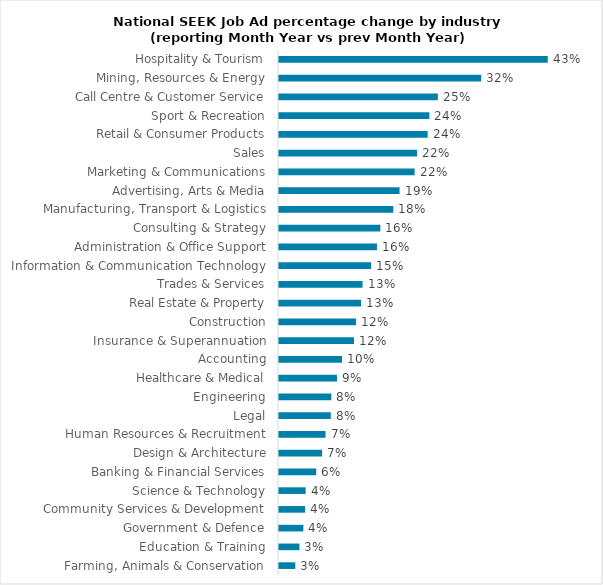
| Category | Series 0 |
|---|---|
| Community Services & Development | 0.08 |
| Farming, Animals & Conservation | 0.069 |
| Hospitality & Tourism | 0.069 |
| Government & Defence | 0.056 |
| Sport & Recreation | 0.056 |
| Engineering | 0.056 |
| Science & Technology | 0.054 |
| Administration & Office Support | 0.052 |
| Advertising, Arts & Media | 0.046 |
| Call Centre & Customer Service | 0.031 |
| Sales | 0.028 |
| Information & Communication Technology | 0.026 |
| Trades & Services | 0.023 |
| Human Resources & Recruitment | 0.022 |
| Healthcare & Medical | 0.021 |
| Design & Architecture | 0.017 |
| Manufacturing, Transport & Logistics | 0.012 |
| Marketing & Communications | 0.009 |
| Education & Training | 0.008 |
| Mining, Resources & Energy | 0.006 |
| Real Estate & Property | 0.001 |
| Accounting | -0.001 |
| Construction | -0.005 |
| Retail & Consumer Products | -0.013 |
| Consulting & Strategy | -0.044 |
| Legal | -0.046 |
| Banking & Financial Services | -0.081 |
| Insurance & Superannuation | -0.153 |